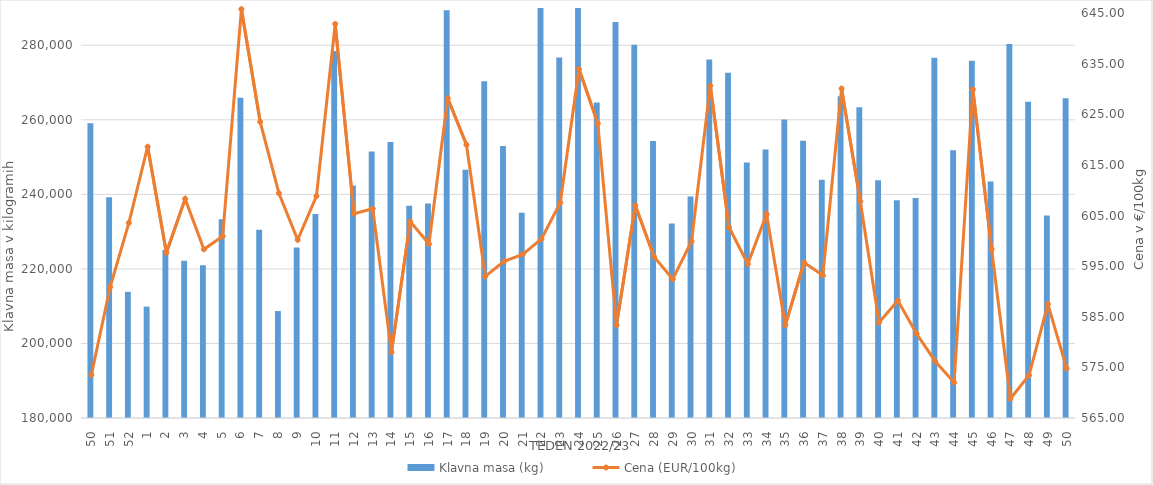
| Category | Klavna masa (kg) |
|---|---|
| 50.0 | 259073 |
| 51.0 | 239211 |
| 52.0 | 213841 |
| 1.0 | 209877 |
| 2.0 | 225045 |
| 3.0 | 222198 |
| 4.0 | 221002 |
| 5.0 | 233306 |
| 6.0 | 265944 |
| 7.0 | 230531 |
| 8.0 | 208699 |
| 9.0 | 225712 |
| 10.0 | 234762 |
| 11.0 | 278467 |
| 12.0 | 242369 |
| 13.0 | 251507 |
| 14.0 | 254072 |
| 15.0 | 236964 |
| 16.0 | 237552 |
| 17.0 | 289400 |
| 18.0 | 246616 |
| 19.0 | 270374 |
| 20.0 | 252984 |
| 21.0 | 235060 |
| 22.0 | 290816 |
| 23.0 | 276702 |
| 24.0 | 292976 |
| 25.0 | 264669 |
| 26.0 | 286237 |
| 27.0 | 280112 |
| 28.0 | 254336 |
| 29.0 | 232178 |
| 30.0 | 239437 |
| 31.0 | 276163 |
| 32.0 | 272647 |
| 33.0 | 248536 |
| 34.0 | 252050 |
| 35.0 | 260110 |
| 36.0 | 254389 |
| 37.0 | 243933 |
| 38.0 | 266321 |
| 39.0 | 263346 |
| 40.0 | 243765 |
| 41.0 | 238404 |
| 42.0 | 239007 |
| 43.0 | 276684 |
| 44.0 | 251832 |
| 45.0 | 275816 |
| 46.0 | 243425 |
| 47.0 | 280350 |
| 48.0 | 264849 |
| 49.0 | 234308 |
| 50.0 | 265786 |